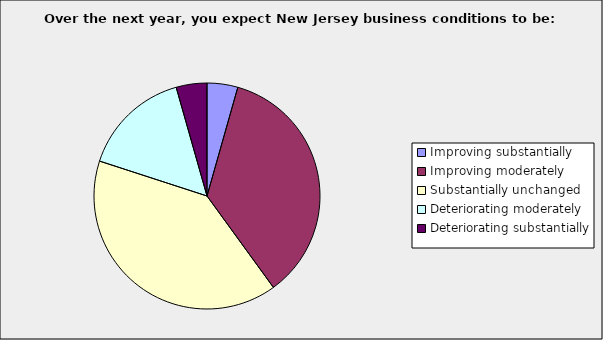
| Category | Series 0 |
|---|---|
| Improving substantially | 0.044 |
| Improving moderately | 0.356 |
| Substantially unchanged | 0.4 |
| Deteriorating moderately | 0.156 |
| Deteriorating substantially | 0.044 |